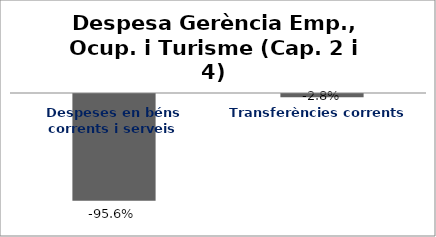
| Category | Series 0 |
|---|---|
| Despeses en béns corrents i serveis | -0.956 |
| Transferències corrents | -0.028 |